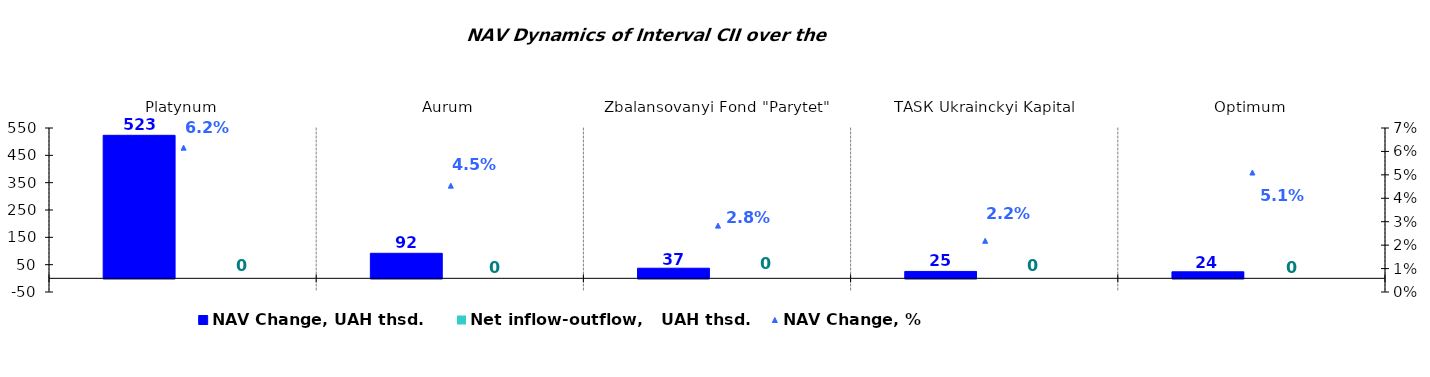
| Category | NAV Change, UAH thsd. | Net inflow-outflow,   UAH thsd. |
|---|---|---|
| Platynum | 523.239 | 0 |
| Аurum | 91.553 | 0 |
| Zbalansovanyi Fond "Parytet" | 36.949 | 0 |
| ТАSК Ukrainckyi Kapital | 25.251 | 0 |
| Оptimum | 23.908 | 0 |